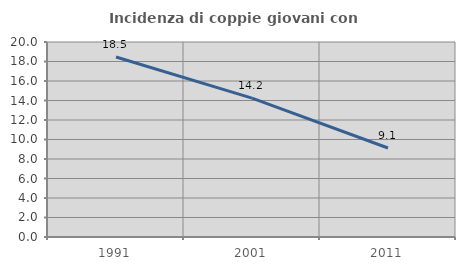
| Category | Incidenza di coppie giovani con figli |
|---|---|
| 1991.0 | 18.46 |
| 2001.0 | 14.239 |
| 2011.0 | 9.13 |